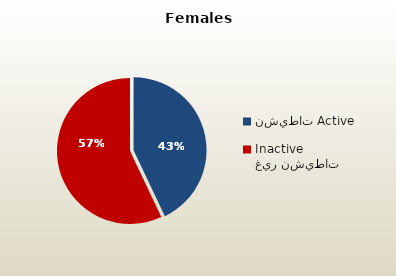
| Category | الاناث القطريات  Qatari Females |
|---|---|
| نشيطات Active | 48159 |
| غير نشيطات Inactive | 63993 |